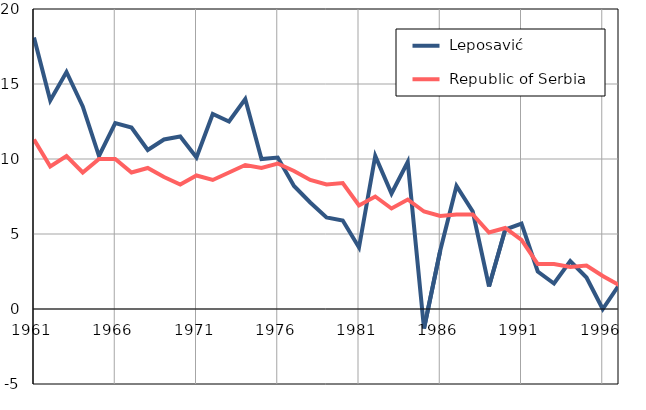
| Category |  Leposavić |  Republic of Serbia |
|---|---|---|
| 1961.0 | 18.1 | 11.3 |
| 1962.0 | 13.9 | 9.5 |
| 1963.0 | 15.8 | 10.2 |
| 1964.0 | 13.5 | 9.1 |
| 1965.0 | 10.2 | 10 |
| 1966.0 | 12.4 | 10 |
| 1967.0 | 12.1 | 9.1 |
| 1968.0 | 10.6 | 9.4 |
| 1969.0 | 11.3 | 8.8 |
| 1970.0 | 11.5 | 8.3 |
| 1971.0 | 10.1 | 8.9 |
| 1972.0 | 13 | 8.6 |
| 1973.0 | 12.5 | 9.1 |
| 1974.0 | 14 | 9.6 |
| 1975.0 | 10 | 9.4 |
| 1976.0 | 10.1 | 9.7 |
| 1977.0 | 8.2 | 9.2 |
| 1978.0 | 7.1 | 8.6 |
| 1979.0 | 6.1 | 8.3 |
| 1980.0 | 5.9 | 8.4 |
| 1981.0 | 4.1 | 6.9 |
| 1982.0 | 10.2 | 7.5 |
| 1983.0 | 7.7 | 6.7 |
| 1984.0 | 9.8 | 7.3 |
| 1985.0 | -1.3 | 6.5 |
| 1986.0 | 3.9 | 6.2 |
| 1987.0 | 8.2 | 6.3 |
| 1988.0 | 6.5 | 6.3 |
| 1989.0 | 1.5 | 5.1 |
| 1990.0 | 5.3 | 5.4 |
| 1991.0 | 5.7 | 4.6 |
| 1992.0 | 2.5 | 3 |
| 1993.0 | 1.7 | 3 |
| 1994.0 | 3.2 | 2.8 |
| 1995.0 | 2.1 | 2.9 |
| 1996.0 | 0 | 2.2 |
| 1997.0 | 1.6 | 1.6 |